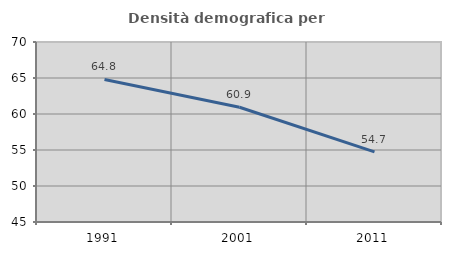
| Category | Densità demografica |
|---|---|
| 1991.0 | 64.792 |
| 2001.0 | 60.931 |
| 2011.0 | 54.744 |